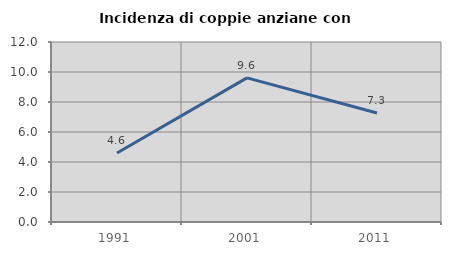
| Category | Incidenza di coppie anziane con figli |
|---|---|
| 1991.0 | 4.601 |
| 2001.0 | 9.61 |
| 2011.0 | 7.267 |